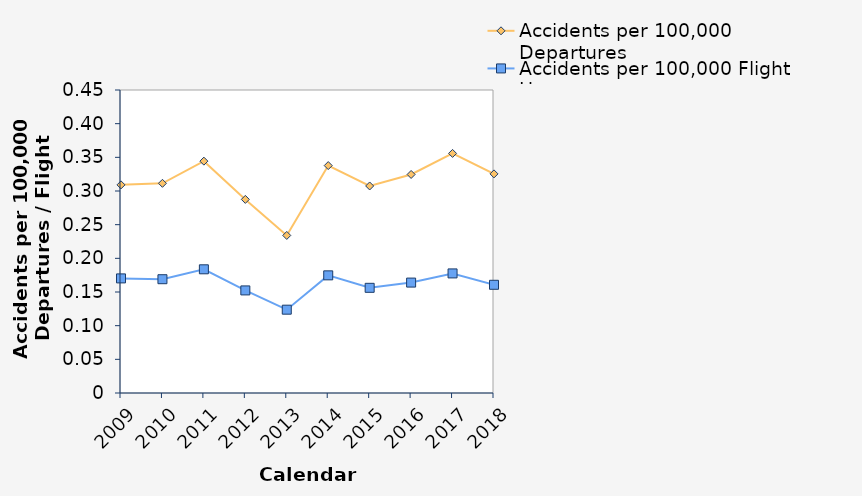
| Category | Accidents per 100,000 Departures | Accidents per 100,000 Flight Hours |
|---|---|---|
| 2009.0 | 0.309 | 0.17 |
| 2010.0 | 0.311 | 0.169 |
| 2011.0 | 0.344 | 0.184 |
| 2012.0 | 0.288 | 0.152 |
| 2013.0 | 0.234 | 0.124 |
| 2014.0 | 0.338 | 0.175 |
| 2015.0 | 0.307 | 0.156 |
| 2016.0 | 0.325 | 0.164 |
| 2017.0 | 0.356 | 0.178 |
| 2018.0 | 0.325 | 0.161 |